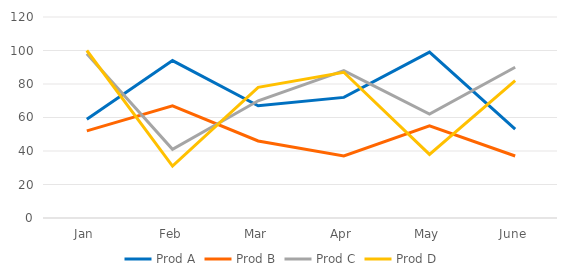
| Category | Prod A | Prod B | Prod C | Prod D |
|---|---|---|---|---|
| Jan | 59 | 52 | 98 | 100 |
| Feb | 94 | 67 | 41 | 31 |
| Mar | 67 | 46 | 70 | 78 |
| Apr | 72 | 37 | 88 | 87 |
| May | 99 | 55 | 62 | 38 |
| June | 53 | 37 | 90 | 82 |